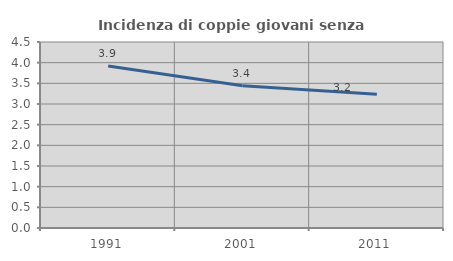
| Category | Incidenza di coppie giovani senza figli |
|---|---|
| 1991.0 | 3.917 |
| 2001.0 | 3.443 |
| 2011.0 | 3.237 |